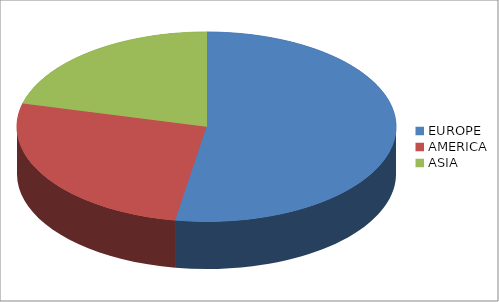
| Category | Series 0 |
|---|---|
| EUROPE | 10 |
| AMERICA | 5 |
| ASIA | 4 |